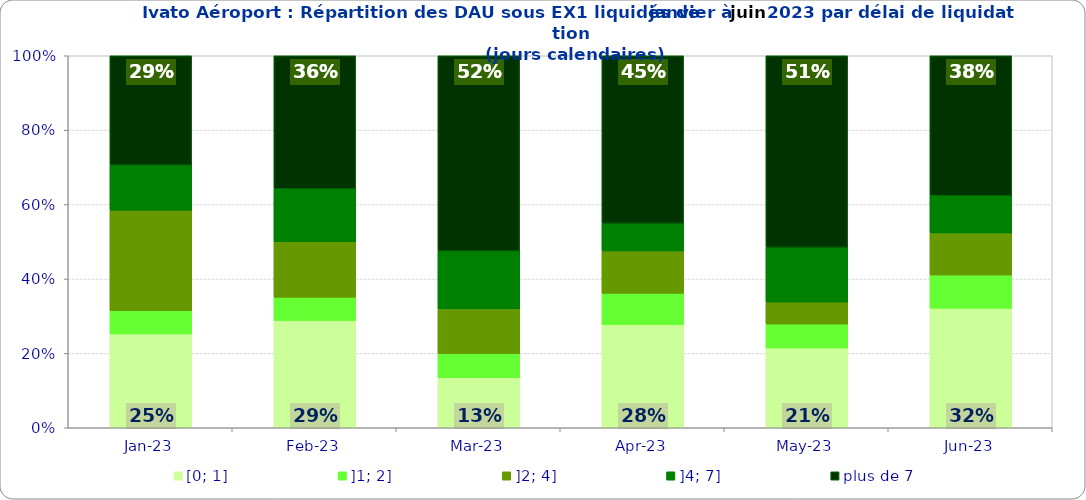
| Category | [0; 1] | ]1; 2] | ]2; 4] | ]4; 7] | plus de 7 |
|---|---|---|---|---|---|
| 2023-01-01 | 0.252 | 0.062 | 0.27 | 0.122 | 0.294 |
| 2023-02-01 | 0.288 | 0.062 | 0.149 | 0.142 | 0.358 |
| 2023-03-01 | 0.135 | 0.065 | 0.12 | 0.155 | 0.525 |
| 2023-04-01 | 0.277 | 0.084 | 0.114 | 0.074 | 0.45 |
| 2023-05-01 | 0.214 | 0.064 | 0.059 | 0.147 | 0.515 |
| 2023-06-01 | 0.321 | 0.089 | 0.113 | 0.1 | 0.376 |